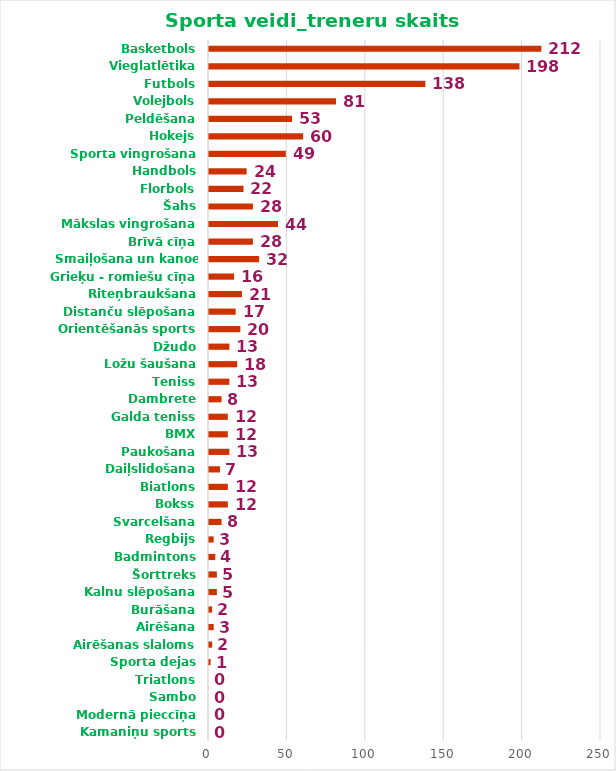
| Category | Treneru 
skaits |
|---|---|
| Kamaniņu sports | 0 |
| Modernā pieccīņa | 0 |
| Sambo | 0 |
| Triatlons | 0 |
| Sporta dejas | 1 |
| Airēšanas slaloms | 2 |
| Airēšana | 3 |
| Burāšana | 2 |
| Kalnu slēpošana | 5 |
| Šorttreks | 5 |
| Badmintons | 4 |
| Regbijs | 3 |
| Svarcelšana | 8 |
| Bokss | 12 |
| Biatlons | 12 |
| Daiļslidošana | 7 |
| Paukošana | 13 |
| BMX | 12 |
| Galda teniss | 12 |
| Dambrete | 8 |
| Teniss | 13 |
| Ložu šaušana | 18 |
| Džudo | 13 |
| Orientēšanās sports | 20 |
| Distanču slēpošana | 17 |
| Riteņbraukšana | 21 |
| Grieķu - romiešu cīņa | 16 |
| Smaiļošana un kanoe airēšana | 32 |
| Brīvā cīņa | 28 |
| Mākslas vingrošana | 44 |
| Šahs | 28 |
| Florbols | 22 |
| Handbols | 24 |
| Sporta vingrošana | 49 |
| Hokejs | 60 |
| Peldēšana | 53 |
| Volejbols | 81 |
| Futbols | 138 |
| Vieglatlētika | 198 |
| Basketbols | 212 |